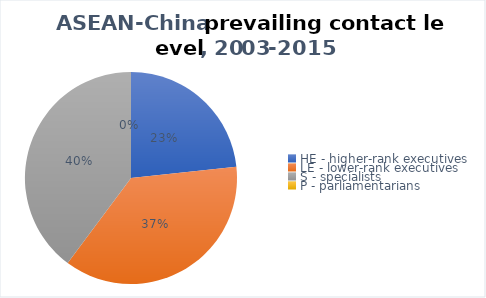
| Category | 2003-2015 |
|---|---|
| HE - higher-rank executives | 48 |
| LE - lower-rank executives | 76 |
| S - specialists | 82 |
| P - parliamentarians | 0 |